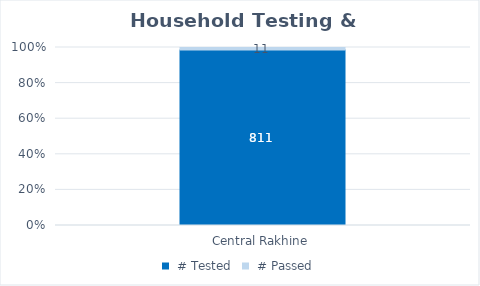
| Category |  # Tested |  # Passed |
|---|---|---|
| Central Rakhine | 811 | 11 |